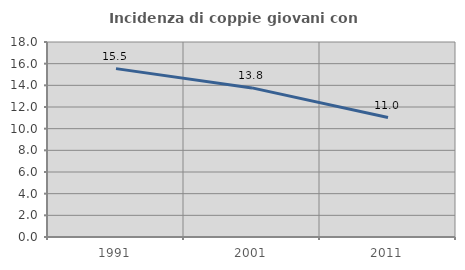
| Category | Incidenza di coppie giovani con figli |
|---|---|
| 1991.0 | 15.542 |
| 2001.0 | 13.763 |
| 2011.0 | 11.024 |